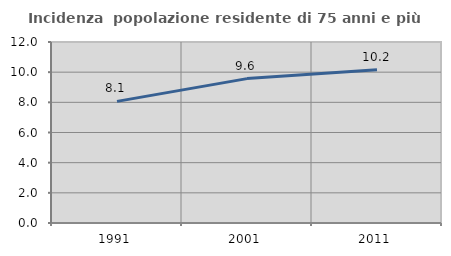
| Category | Incidenza  popolazione residente di 75 anni e più |
|---|---|
| 1991.0 | 8.065 |
| 2001.0 | 9.572 |
| 2011.0 | 10.162 |